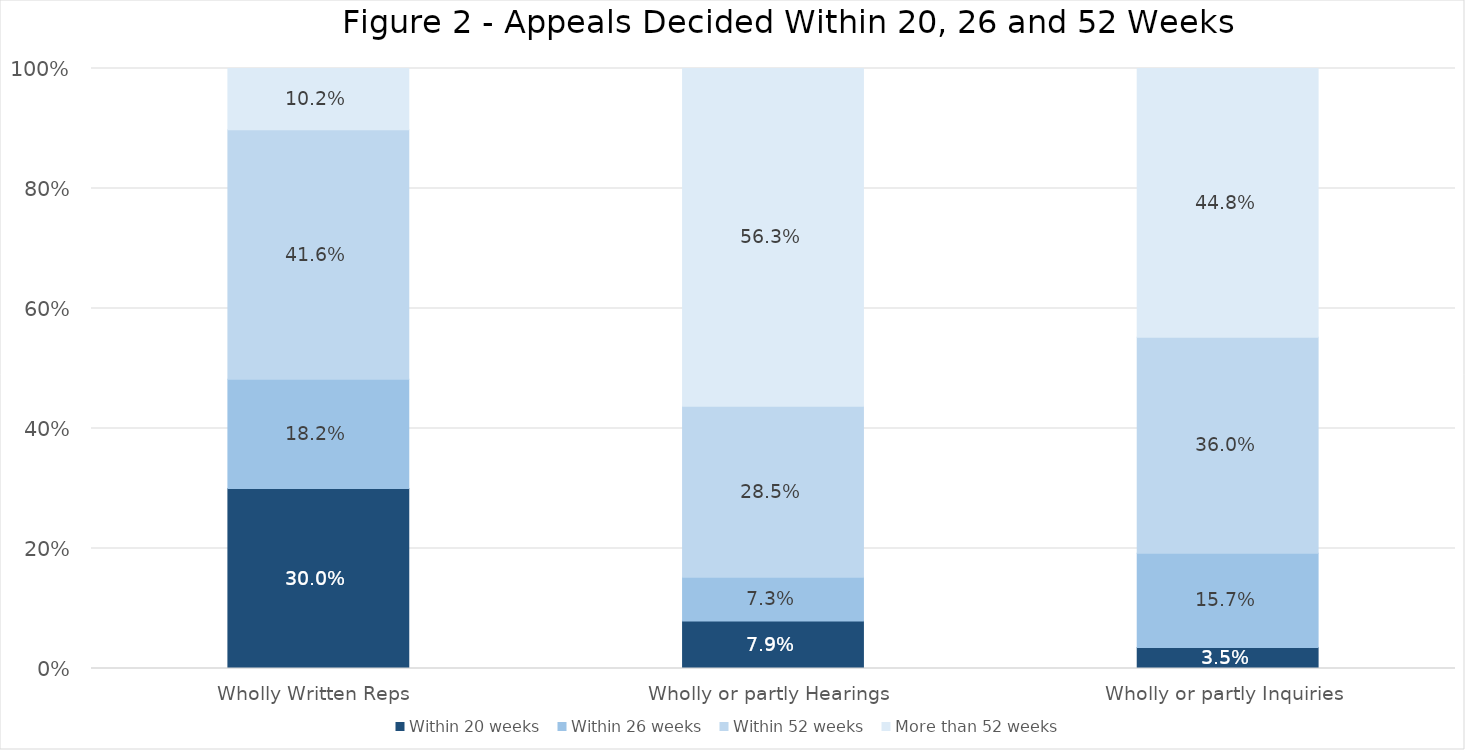
| Category | Within 20 weeks  | Within 26 weeks  | Within 52 weeks  | More than 52 weeks  |
|---|---|---|---|---|
| Wholly Written Reps  | 0.3 | 0.182 | 0.416 | 0.102 |
| Wholly or partly Hearings  | 0.079 | 0.073 | 0.285 | 0.563 |
| Wholly or partly Inquiries  | 0.035 | 0.157 | 0.36 | 0.448 |